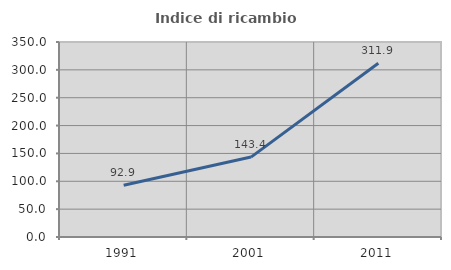
| Category | Indice di ricambio occupazionale  |
|---|---|
| 1991.0 | 92.902 |
| 2001.0 | 143.436 |
| 2011.0 | 311.907 |